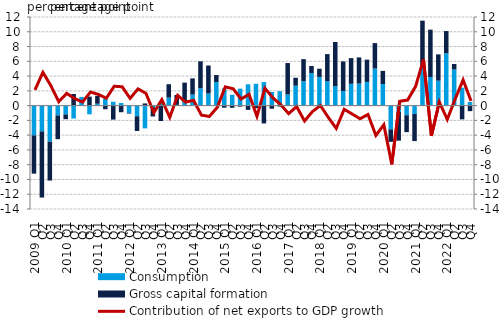
| Category | Consumption | Gross capital formation |
|---|---|---|
| 2009 Q1 | -4.032 | -5.18 |
| Q2 | -3.484 | -8.963 |
| Q3 | -4.871 | -5.275 |
| Q4 | -1.326 | -3.221 |
| 2010 Q1 | -1.191 | -0.647 |
| Q2 | -1.753 | 1.575 |
| Q3 | 1.179 | -0.011 |
| Q4 | -1.177 | 1.219 |
| 2011 Q1 | 0.252 | 1.073 |
| Q2 | 0.955 | -0.488 |
| Q3 | 0.522 | -1.893 |
| Q4 | 0.354 | -0.897 |
| 2012 Q1 | -0.992 | -0.085 |
| Q2 | -1.436 | -1.996 |
| Q3 | -3.081 | 0.294 |
| Q4 | -0.215 | -1.252 |
| 2013 Q1 | 0.412 | -2.088 |
| Q2 | 1.086 | 1.81 |
| Q3 | 0.103 | 1.333 |
| Q4 | 0.455 | 2.66 |
| 2014 Q1 | 1.489 | 2.202 |
| Q2 | 2.351 | 3.647 |
| Q3 | 1.636 | 3.793 |
| Q4 | 3.2 | 0.941 |
| 2015 Q1 | 2.32 | -0.28 |
| Q2 | 1.459 | -0.298 |
| Q3 | 2.298 | -0.134 |
| Q4 | 2.886 | -0.579 |
| 2016 Q1 | 2.955 | -0.349 |
| Q2 | 3.19 | -2.415 |
| Q3 | 1.848 | -0.419 |
| Q4 | 1.95 | -0.125 |
| 2017 Q1 | 1.51 | 4.256 |
| Q2 | 2.697 | 1.075 |
| Q3 | 3.3 | 2.996 |
| Q4 | 4.397 | 0.973 |
| 2018 Q1 | 3.885 | 1.113 |
| Q2 | 3.299 | 3.676 |
| Q3 | 2.624 | 5.988 |
| Q4 | 1.971 | 4.016 |
| 2019 Q1 | 2.949 | 3.483 |
| Q2 | 2.986 | 3.543 |
| Q3 | 3.211 | 3.011 |
| Q4 | 5.023 | 3.439 |
| 2020 Q1 | 2.93 | 1.774 |
| Q2 | -3.217 | -1.688 |
| Q3 | -0.861 | -3.887 |
| Q4 | -1.301 | -2.292 |
| 2021 Q1 | -1.131 | -3.672 |
| Q2 | 5.454 | 6.05 |
| Q3 | 3.877 | 6.41 |
| Q4 | 3.376 | 3.562 |
| 2022 Q1 | 7.09 | 3.007 |
| Q2 | 4.897 | 0.736 |
| Q3 | 2.419 | -1.864 |
| Q4 | 0.488 | -0.75 |